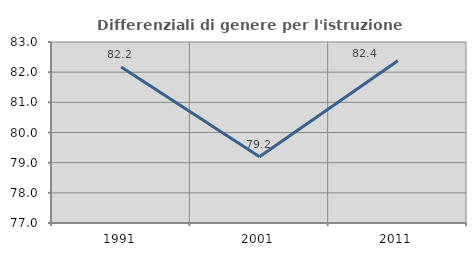
| Category | Differenziali di genere per l'istruzione superiore |
|---|---|
| 1991.0 | 82.167 |
| 2001.0 | 79.196 |
| 2011.0 | 82.378 |